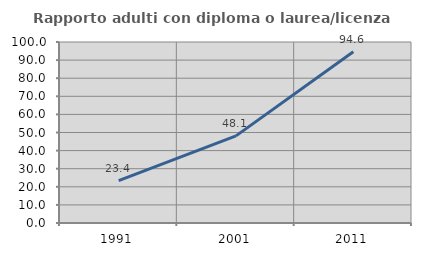
| Category | Rapporto adulti con diploma o laurea/licenza media  |
|---|---|
| 1991.0 | 23.404 |
| 2001.0 | 48.148 |
| 2011.0 | 94.643 |